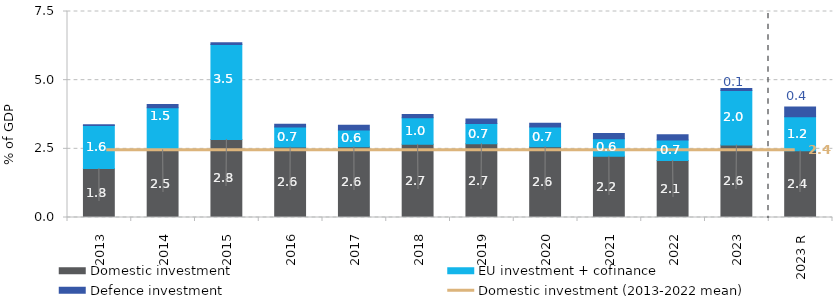
| Category | Domestic investment | EU investment + cofinance | Defence investment |
|---|---|---|---|
| 2013 | 1.782 | 1.568 | 0.025 |
| 2014 | 2.46 | 1.537 | 0.114 |
| 2015 | 2.841 | 3.454 | 0.065 |
| 2016 | 2.563 | 0.735 | 0.097 |
| 2017 | 2.571 | 0.613 | 0.176 |
| 2018 | 2.662 | 0.973 | 0.116 |
| 2019 | 2.687 | 0.735 | 0.166 |
| 2020 | 2.577 | 0.722 | 0.135 |
| 2021 | 2.23 | 0.639 | 0.189 |
| 2022 | 2.077 | 0.741 | 0.193 |
| 2023 | 2.638 | 1.986 | 0.071 |
| 2023 R | 2.431 | 1.236 | 0.354 |